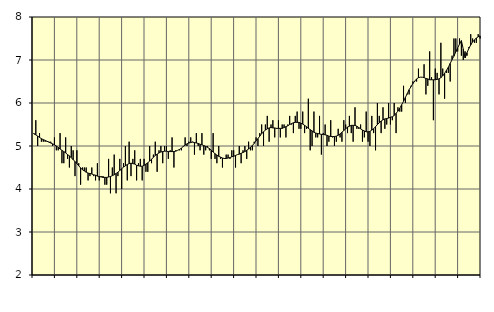
| Category | Piggar | Information och kommunikation, SNI 58-63 |
|---|---|---|
| nan | 5.3 | 5.28 |
| 1.0 | 5.6 | 5.26 |
| 1.0 | 5 | 5.23 |
| 1.0 | 5.3 | 5.2 |
| 1.0 | 5.1 | 5.17 |
| 1.0 | 5.1 | 5.15 |
| 1.0 | 5.1 | 5.13 |
| 1.0 | 5.1 | 5.11 |
| 1.0 | 5.1 | 5.09 |
| 1.0 | 5.1 | 5.07 |
| 1.0 | 5 | 5.05 |
| 1.0 | 5.2 | 5.03 |
| nan | 4.9 | 5 |
| 2.0 | 4.9 | 4.97 |
| 2.0 | 5.3 | 4.93 |
| 2.0 | 4.6 | 4.9 |
| 2.0 | 4.6 | 4.87 |
| 2.0 | 5.2 | 4.84 |
| 2.0 | 4.7 | 4.8 |
| 2.0 | 4.5 | 4.77 |
| 2.0 | 5 | 4.73 |
| 2.0 | 4.9 | 4.68 |
| 2.0 | 4.3 | 4.64 |
| 2.0 | 4.9 | 4.59 |
| nan | 4.6 | 4.54 |
| 3.0 | 4.1 | 4.49 |
| 3.0 | 4.5 | 4.45 |
| 3.0 | 4.5 | 4.42 |
| 3.0 | 4.5 | 4.39 |
| 3.0 | 4.2 | 4.37 |
| 3.0 | 4.3 | 4.36 |
| 3.0 | 4.5 | 4.35 |
| 3.0 | 4.3 | 4.33 |
| 3.0 | 4.2 | 4.32 |
| 3.0 | 4.6 | 4.3 |
| 3.0 | 4.2 | 4.29 |
| nan | 4.3 | 4.28 |
| 4.0 | 4.3 | 4.27 |
| 4.0 | 4.1 | 4.27 |
| 4.0 | 4.1 | 4.27 |
| 4.0 | 4.7 | 4.28 |
| 4.0 | 3.9 | 4.29 |
| 4.0 | 4.5 | 4.31 |
| 4.0 | 4.8 | 4.33 |
| 4.0 | 3.9 | 4.36 |
| 4.0 | 4.3 | 4.39 |
| 4.0 | 4.7 | 4.43 |
| 4.0 | 4 | 4.47 |
| nan | 4.6 | 4.51 |
| 5.0 | 5 | 4.54 |
| 5.0 | 4.2 | 4.57 |
| 5.0 | 5.1 | 4.59 |
| 5.0 | 4.3 | 4.6 |
| 5.0 | 4.7 | 4.59 |
| 5.0 | 4.9 | 4.58 |
| 5.0 | 4.2 | 4.55 |
| 5.0 | 4.6 | 4.54 |
| 5.0 | 4.7 | 4.53 |
| 5.0 | 4.2 | 4.53 |
| 5.0 | 4.7 | 4.55 |
| nan | 4.4 | 4.58 |
| 6.0 | 4.4 | 4.61 |
| 6.0 | 5 | 4.65 |
| 6.0 | 4.6 | 4.69 |
| 6.0 | 4.8 | 4.74 |
| 6.0 | 5.1 | 4.78 |
| 6.0 | 4.4 | 4.81 |
| 6.0 | 4.9 | 4.84 |
| 6.0 | 5 | 4.86 |
| 6.0 | 4.6 | 4.87 |
| 6.0 | 5 | 4.88 |
| 6.0 | 5 | 4.88 |
| nan | 4.7 | 4.87 |
| 7.0 | 4.9 | 4.87 |
| 7.0 | 5.2 | 4.87 |
| 7.0 | 4.5 | 4.87 |
| 7.0 | 4.9 | 4.88 |
| 7.0 | 4.9 | 4.9 |
| 7.0 | 4.9 | 4.92 |
| 7.0 | 4.9 | 4.95 |
| 7.0 | 5 | 4.99 |
| 7.0 | 5.2 | 5.02 |
| 7.0 | 5 | 5.05 |
| 7.0 | 5.1 | 5.07 |
| nan | 5.2 | 5.08 |
| 8.0 | 5.1 | 5.09 |
| 8.0 | 4.8 | 5.08 |
| 8.0 | 5.3 | 5.07 |
| 8.0 | 5 | 5.06 |
| 8.0 | 4.9 | 5.04 |
| 8.0 | 5.3 | 5.03 |
| 8.0 | 4.8 | 5.01 |
| 8.0 | 4.9 | 4.99 |
| 8.0 | 5 | 4.97 |
| 8.0 | 4.9 | 4.94 |
| 8.0 | 4.7 | 4.9 |
| nan | 5.3 | 4.86 |
| 9.0 | 4.7 | 4.82 |
| 9.0 | 4.6 | 4.79 |
| 9.0 | 5 | 4.76 |
| 9.0 | 4.7 | 4.74 |
| 9.0 | 4.5 | 4.72 |
| 9.0 | 4.7 | 4.71 |
| 9.0 | 4.8 | 4.71 |
| 9.0 | 4.8 | 4.72 |
| 9.0 | 4.7 | 4.73 |
| 9.0 | 4.9 | 4.75 |
| 9.0 | 4.9 | 4.76 |
| nan | 4.5 | 4.78 |
| 10.0 | 4.8 | 4.8 |
| 10.0 | 5 | 4.81 |
| 10.0 | 4.6 | 4.83 |
| 10.0 | 4.9 | 4.85 |
| 10.0 | 5 | 4.87 |
| 10.0 | 4.7 | 4.9 |
| 10.0 | 5.1 | 4.93 |
| 10.0 | 4.9 | 4.97 |
| 10.0 | 4.9 | 5.01 |
| 10.0 | 5.1 | 5.06 |
| 10.0 | 5.2 | 5.12 |
| nan | 5 | 5.17 |
| 11.0 | 5.3 | 5.23 |
| 11.0 | 5.5 | 5.29 |
| 11.0 | 5 | 5.33 |
| 11.0 | 5.5 | 5.37 |
| 11.0 | 5.7 | 5.4 |
| 11.0 | 5.1 | 5.42 |
| 11.0 | 5.5 | 5.43 |
| 11.0 | 5.6 | 5.42 |
| 11.0 | 5.2 | 5.42 |
| 11.0 | 5.4 | 5.41 |
| 11.0 | 5.6 | 5.41 |
| nan | 5.2 | 5.41 |
| 12.0 | 5.5 | 5.41 |
| 12.0 | 5.5 | 5.43 |
| 12.0 | 5.2 | 5.45 |
| 12.0 | 5.5 | 5.47 |
| 12.0 | 5.7 | 5.5 |
| 12.0 | 5.5 | 5.52 |
| 12.0 | 5.3 | 5.54 |
| 12.0 | 5.7 | 5.55 |
| 12.0 | 5.8 | 5.55 |
| 12.0 | 5.4 | 5.55 |
| 12.0 | 5.4 | 5.53 |
| nan | 5.8 | 5.51 |
| 13.0 | 5.3 | 5.48 |
| 13.0 | 5.4 | 5.45 |
| 13.0 | 6.1 | 5.41 |
| 13.0 | 4.9 | 5.38 |
| 13.0 | 5 | 5.35 |
| 13.0 | 5.8 | 5.32 |
| 13.0 | 5.2 | 5.3 |
| 13.0 | 5.2 | 5.29 |
| 13.0 | 5.7 | 5.28 |
| 13.0 | 4.8 | 5.27 |
| 13.0 | 5.3 | 5.27 |
| nan | 5.5 | 5.26 |
| 14.0 | 5 | 5.25 |
| 14.0 | 5.1 | 5.23 |
| 14.0 | 5.6 | 5.22 |
| 14.0 | 5.2 | 5.22 |
| 14.0 | 5 | 5.22 |
| 14.0 | 5.1 | 5.23 |
| 14.0 | 5.4 | 5.25 |
| 14.0 | 5.2 | 5.28 |
| 14.0 | 5.1 | 5.32 |
| 14.0 | 5.6 | 5.36 |
| 14.0 | 5.5 | 5.4 |
| nan | 5.3 | 5.44 |
| 15.0 | 5.7 | 5.46 |
| 15.0 | 5.3 | 5.48 |
| 15.0 | 5.1 | 5.48 |
| 15.0 | 5.9 | 5.48 |
| 15.0 | 5.4 | 5.46 |
| 15.0 | 5.4 | 5.43 |
| 15.0 | 5.5 | 5.4 |
| 15.0 | 5.1 | 5.37 |
| 15.0 | 5.2 | 5.35 |
| 15.0 | 5.8 | 5.33 |
| 15.0 | 5.1 | 5.33 |
| nan | 5 | 5.34 |
| 16.0 | 5.7 | 5.37 |
| 16.0 | 5.3 | 5.4 |
| 16.0 | 4.9 | 5.45 |
| 16.0 | 6 | 5.5 |
| 16.0 | 5.7 | 5.54 |
| 16.0 | 5.3 | 5.58 |
| 16.0 | 5.9 | 5.61 |
| 16.0 | 5.4 | 5.63 |
| 16.0 | 5.5 | 5.64 |
| 16.0 | 6 | 5.65 |
| 16.0 | 5.5 | 5.67 |
| nan | 5.6 | 5.68 |
| 17.0 | 6 | 5.71 |
| 17.0 | 5.3 | 5.76 |
| 17.0 | 5.9 | 5.81 |
| 17.0 | 5.8 | 5.88 |
| 17.0 | 5.8 | 5.96 |
| 17.0 | 6.4 | 6.04 |
| 17.0 | 6 | 6.13 |
| 17.0 | 6.2 | 6.22 |
| 17.0 | 6.2 | 6.31 |
| 17.0 | 6.4 | 6.38 |
| 17.0 | 6.5 | 6.45 |
| nan | 6.5 | 6.51 |
| 18.0 | 6.5 | 6.56 |
| 18.0 | 6.8 | 6.59 |
| 18.0 | 6.6 | 6.6 |
| 18.0 | 6.6 | 6.6 |
| 18.0 | 6.9 | 6.59 |
| 18.0 | 6.2 | 6.57 |
| 18.0 | 6.4 | 6.56 |
| 18.0 | 7.2 | 6.54 |
| 18.0 | 6.6 | 6.54 |
| 18.0 | 5.6 | 6.54 |
| 18.0 | 6.8 | 6.54 |
| nan | 6.7 | 6.55 |
| 19.0 | 6.2 | 6.56 |
| 19.0 | 7.4 | 6.59 |
| 19.0 | 6.8 | 6.63 |
| 19.0 | 6.1 | 6.69 |
| 19.0 | 6.7 | 6.76 |
| 19.0 | 6.7 | 6.83 |
| 19.0 | 6.5 | 6.92 |
| 19.0 | 7.1 | 7.01 |
| 19.0 | 7.5 | 7.09 |
| 19.0 | 7.5 | 7.19 |
| 19.0 | 7.2 | 7.28 |
| nan | 7.5 | 7.37 |
| 20.0 | 7.1 | 7.45 |
| 20.0 | 7 | 7.25 |
| 20.0 | 7.2 | 7.05 |
| 20.0 | 7.1 | 7.17 |
| 20.0 | 7.3 | 7.27 |
| 20.0 | 7.6 | 7.35 |
| 20.0 | 7.5 | 7.42 |
| 20.0 | 7.4 | 7.47 |
| 20.0 | 7.4 | 7.51 |
| 20.0 | 7.6 | 7.54 |
| 20.0 | 7.5 | 7.56 |